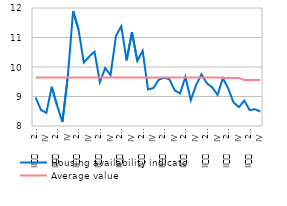
| Category | Housing availability indicator | Average value |
|---|---|---|
| II
     2008 | 8.966 | 9.647 |
| III | 8.544 | 9.647 |
| IV | 8.447 | 9.647 |
| I
2009 | 9.329 | 9.647 |
| II
     2009 | 8.694 | 9.647 |
| III | 8.139 | 9.647 |
| IV
 | 9.67 | 9.647 |
| I
2010 | 11.895 | 9.647 |
| II
     2010 | 11.278 | 9.647 |
| III | 10.149 | 9.647 |
| IV | 10.355 | 9.647 |
| I
2011 | 10.519 | 9.647 |
| II
     2011 | 9.488 | 9.647 |
| III | 9.964 | 9.647 |
| IV | 9.722 | 9.647 |
| I
2012 | 11.044 | 9.647 |
| II
     2012 | 11.386 | 9.647 |
| III | 10.226 | 9.647 |
| IV | 11.184 | 9.647 |
| I
2013 | 10.209 | 9.647 |
| II
     2013 | 10.549 | 9.647 |
| III | 9.239 | 9.647 |
| IV | 9.287 | 9.647 |
| I
2014 | 9.567 | 9.647 |
| II
     2014 | 9.635 | 9.647 |
| III | 9.586 | 9.647 |
| IV | 9.206 | 9.647 |
| I
2015 | 9.106 | 9.647 |
| II
     2015 | 9.669 | 9.647 |
| III | 8.874 | 9.647 |
| IV | 9.396 | 9.647 |
| I
2016 | 9.754 | 9.647 |
| II
     2016 | 9.448 | 9.647 |
| III | 9.313 | 9.647 |
| IV | 9.056 | 9.647 |
| I
2017 | 9.624 | 9.627 |
| II
     2017 | 9.27 | 9.627 |
| III | 8.798 | 9.631 |
| IV | 8.64 | 9.63 |
| I
2018 | 8.86 | 9.557 |
| II
     2018 | 8.539 | 9.557 |
| III | 8.57 | 9.557 |
| IV | 8.487 | 9.557 |